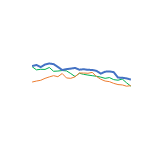
| Category | Item1 | Item2 | Item3 |
|---|---|---|---|
| 0 | 6390 | 6446 | 4997 |
| 1 | 6105 | 6546 | 5088 |
| 2 | 6152 | 6356 | 5156 |
| 3 | 6144 | 6589 | 5332 |
| 4 | 6319 | 6684 | 5463 |
| 5 | 5974 | 6624 | 5576 |
| 6 | 5996 | 6366 | 5482 |
| 7 | 6042 | 6091 | 5772 |
| 8 | 6010 | 6169 | 5368 |
| 9 | 5768 | 6218 | 5333 |
| 10 | 5497 | 6279 | 5472 |
| 11 | 5793 | 6118 | 5817 |
| 12 | 5698 | 6162 | 5815 |
| 13 | 5630 | 6104 | 5794 |
| 14 | 5575 | 6100 | 5875 |
| 15 | 5519 | 6011 | 5502 |
| 16 | 5441 | 5759 | 5248 |
| 17 | 5333 | 5938 | 5088 |
| 18 | 5401 | 5963 | 5033 |
| 19 | 5215 | 5896 | 4877 |
| 20 | 5162 | 5403 | 4767 |
| 21 | 5269 | 5386 | 4733 |
| 22 | 4925 | 5327 | 4619 |
| 23 | 4618 | 5219 | 4670 |